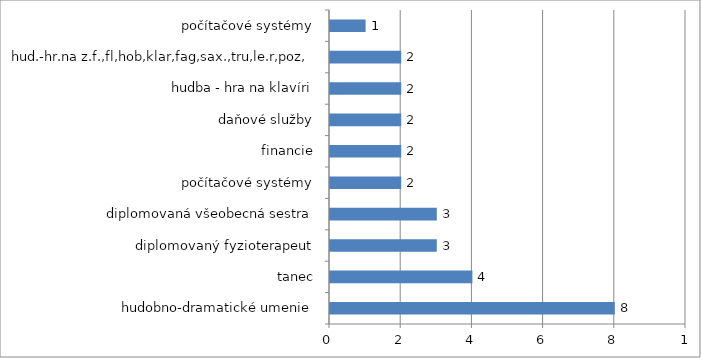
| Category | Series 0 |
|---|---|
| hudobno-dramatické umenie | 8 |
| tanec | 4 |
| diplomovaný fyzioterapeut | 3 |
| diplomovaná všeobecná sestra | 3 |
| počítačové systémy | 2 |
| financie | 2 |
| daňové služby | 2 |
| hudba - hra na klavíri | 2 |
| hud.-hr.na z.f.,fl,hob,klar,fag,sax.,tru,le.r,poz, | 2 |
| počítačové systémy | 1 |